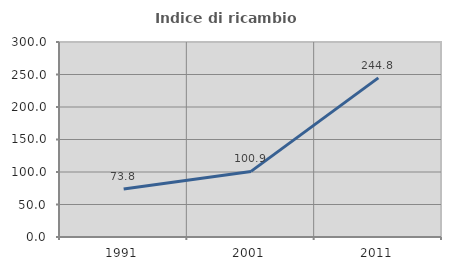
| Category | Indice di ricambio occupazionale  |
|---|---|
| 1991.0 | 73.821 |
| 2001.0 | 100.905 |
| 2011.0 | 244.796 |